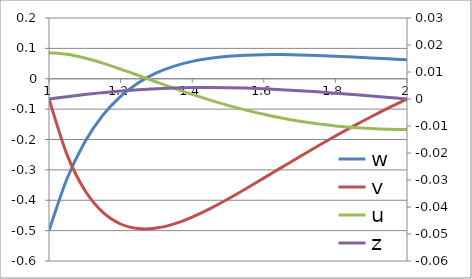
| Category | w |
|---|---|
| 1.0 | -0.5 |
| 1.05 | -0.33 |
| 1.1 | -0.208 |
| 1.1500000000000001 | -0.121 |
| 1.2000000000000002 | -0.058 |
| 1.2500000000000002 | -0.013 |
| 1.3000000000000003 | 0.019 |
| 1.3500000000000003 | 0.042 |
| 1.4000000000000004 | 0.057 |
| 1.4500000000000004 | 0.068 |
| 1.5000000000000004 | 0.074 |
| 1.5500000000000005 | 0.078 |
| 1.6000000000000005 | 0.079 |
| 1.6500000000000006 | 0.079 |
| 1.7000000000000006 | 0.078 |
| 1.7500000000000007 | 0.077 |
| 1.8000000000000007 | 0.074 |
| 1.8500000000000008 | 0.072 |
| 1.9000000000000008 | 0.069 |
| 1.9500000000000008 | 0.066 |
| 2.0 | 0.063 |